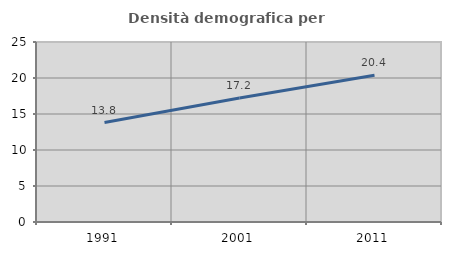
| Category | Densità demografica |
|---|---|
| 1991.0 | 13.815 |
| 2001.0 | 17.23 |
| 2011.0 | 20.386 |